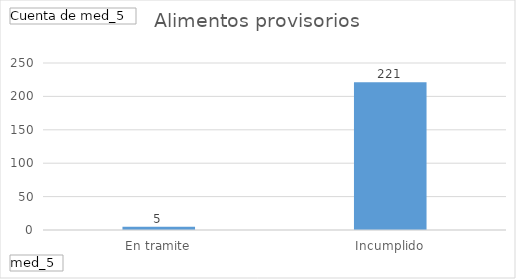
| Category | Total |
|---|---|
| En tramite | 5 |
| Incumplido | 221 |